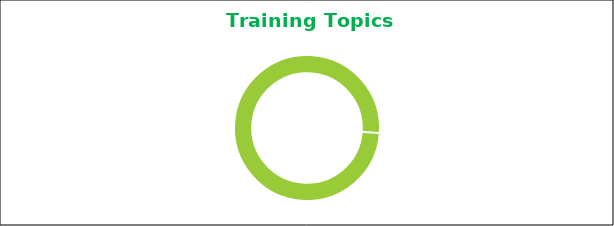
| Category | Series 0 |
|---|---|
| 0 | 693 |
| 1 | 0 |